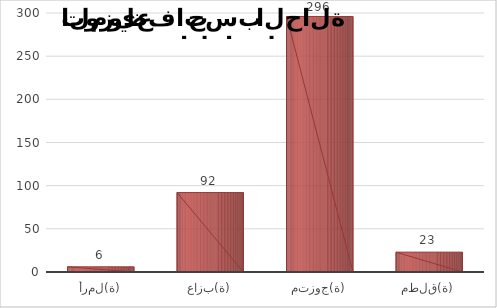
| Category | Series 1 |
|---|---|
| أرمل(ة) | 6 |
| عازب(ة) | 92 |
| متزوج(ة) | 296 |
| مطلق(ة) | 23 |